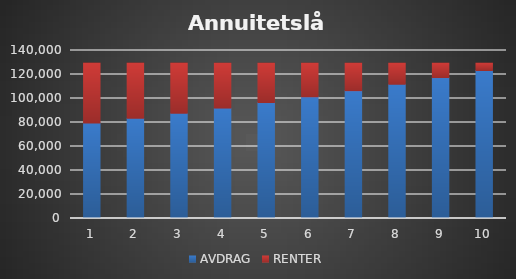
| Category | AVDRAG | RENTER |
|---|---|---|
| 0 | 79504.575 | 50000 |
| 1 | 83479.804 | 46024.771 |
| 2 | 87653.794 | 41850.781 |
| 3 | 92036.484 | 37468.091 |
| 4 | 96638.308 | 32866.267 |
| 5 | 101470.223 | 28034.352 |
| 6 | 106543.734 | 22960.841 |
| 7 | 111870.921 | 17633.654 |
| 8 | 117464.467 | 12040.108 |
| 9 | 123337.69 | 6166.885 |